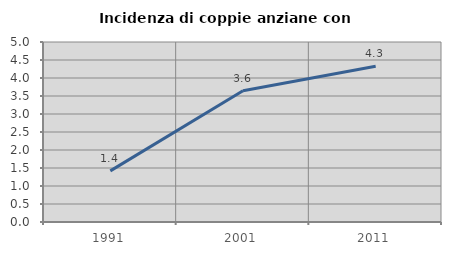
| Category | Incidenza di coppie anziane con figli |
|---|---|
| 1991.0 | 1.419 |
| 2001.0 | 3.646 |
| 2011.0 | 4.325 |